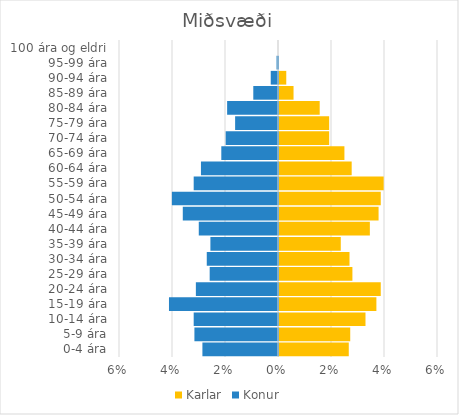
| Category | Karlar | Konur |
|---|---|---|
| 0-4 ára | 0.026 | -0.029 |
| 5-9 ára | 0.027 | -0.032 |
| 10-14 ára | 0.033 | -0.032 |
| 15-19 ára | 0.037 | -0.041 |
| 20-24 ára | 0.038 | -0.031 |
| 25-29 ára | 0.028 | -0.026 |
| 30-34 ára | 0.027 | -0.027 |
| 35-39 ára | 0.023 | -0.026 |
| 40-44 ára | 0.034 | -0.03 |
| 45-49 ára | 0.038 | -0.036 |
| 50-54 ára | 0.038 | -0.04 |
| 55-59 ára | 0.039 | -0.032 |
| 60-64 ára | 0.027 | -0.029 |
| 65-69 ára | 0.025 | -0.021 |
| 70-74 ára | 0.019 | -0.02 |
| 75-79 ára | 0.019 | -0.016 |
| 80-84 ára | 0.015 | -0.019 |
| 85-89 ára | 0.005 | -0.009 |
| 90-94 ára | 0.003 | -0.003 |
| 95-99 ára | 0 | -0.001 |
| 100 ára og eldri | 0 | 0 |